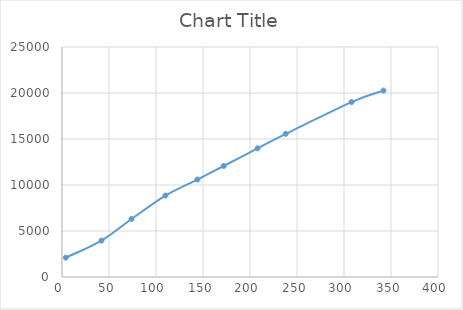
| Category | Series 0 |
|---|---|
| 4.0 | 2102 |
| 42.0 | 3960 |
| 74.0 | 6309 |
| 110.0 | 8854 |
| 144.0 | 10592 |
| 172.0 | 12065 |
| 208.0 | 13985 |
| 238.0 | 15564 |
| 308.0 | 19015 |
| 342.0 | 20264 |